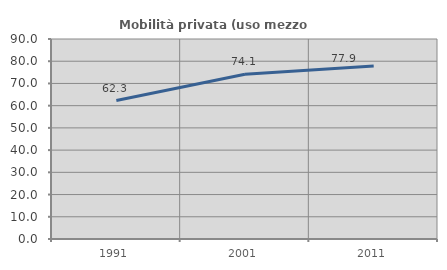
| Category | Mobilità privata (uso mezzo privato) |
|---|---|
| 1991.0 | 62.286 |
| 2001.0 | 74.122 |
| 2011.0 | 77.901 |